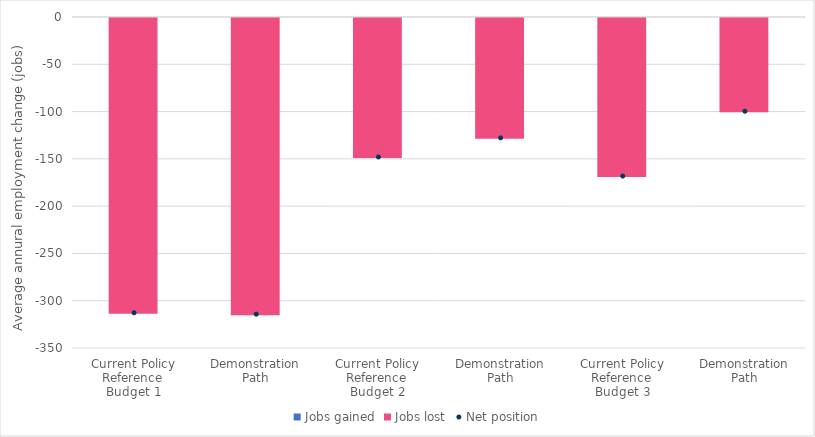
| Category | Jobs gained | Jobs lost |
|---|---|---|
| 0 | 0 | -312.75 |
| 1 | 0 | -314.25 |
| 2 | 0 | -148 |
| 3 | 0 | -127.8 |
| 4 | 0 | -168.2 |
| 5 | 0 | -99.6 |